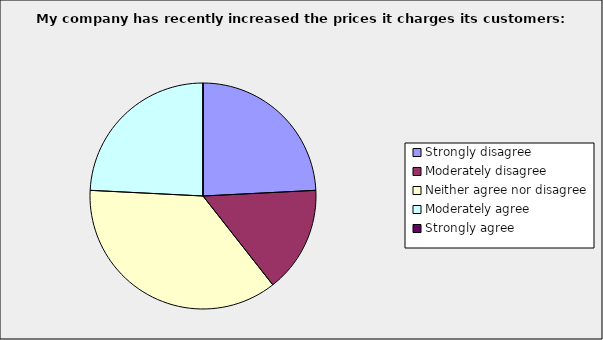
| Category | Series 0 |
|---|---|
| Strongly disagree | 0.242 |
| Moderately disagree | 0.152 |
| Neither agree nor disagree | 0.364 |
| Moderately agree | 0.242 |
| Strongly agree | 0 |